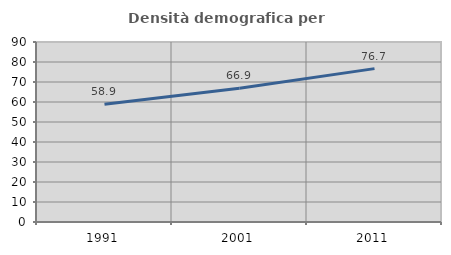
| Category | Densità demografica |
|---|---|
| 1991.0 | 58.926 |
| 2001.0 | 66.921 |
| 2011.0 | 76.693 |